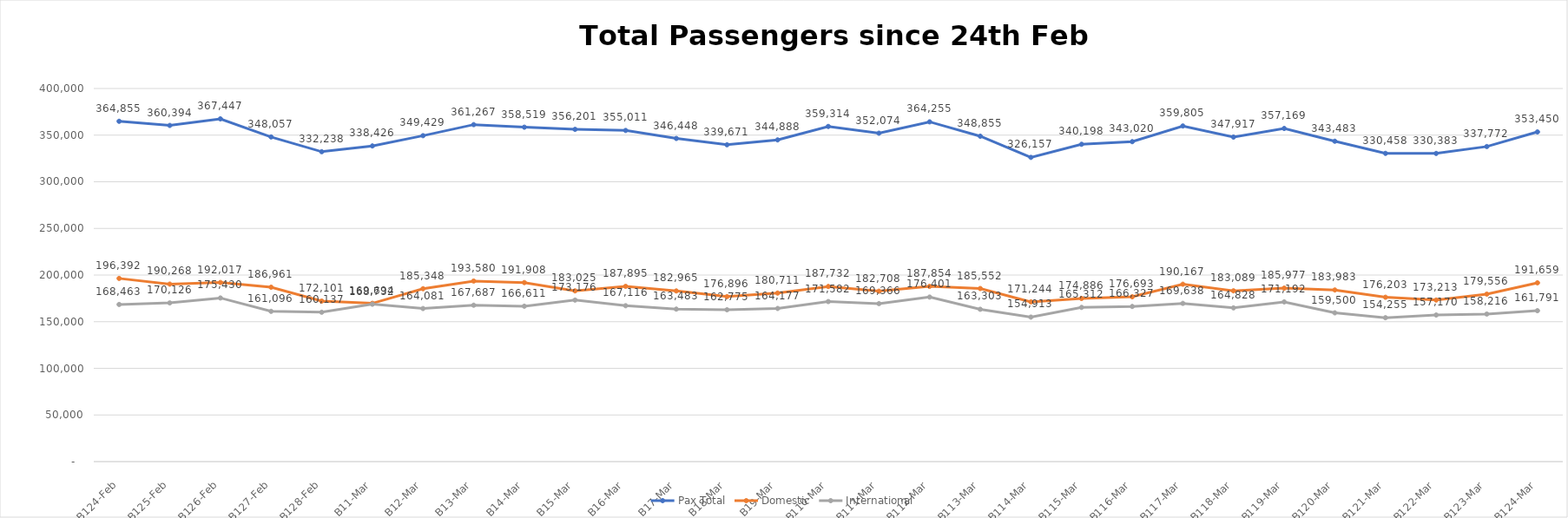
| Category | Pax Total |  Domestic  |  International  |
|---|---|---|---|
| 2023-02-24 | 364855 | 196392 | 168463 |
| 2023-02-25 | 360394 | 190268 | 170126 |
| 2023-02-26 | 367447 | 192017 | 175430 |
| 2023-02-27 | 348057 | 186961 | 161096 |
| 2023-02-28 | 332238 | 172101 | 160137 |
| 2023-03-01 | 338426 | 169694 | 168732 |
| 2023-03-02 | 349429 | 185348 | 164081 |
| 2023-03-03 | 361267 | 193580 | 167687 |
| 2023-03-04 | 358519 | 191908 | 166611 |
| 2023-03-05 | 356201 | 183025 | 173176 |
| 2023-03-06 | 355011 | 187895 | 167116 |
| 2023-03-07 | 346448 | 182965 | 163483 |
| 2023-03-08 | 339671 | 176896 | 162775 |
| 2023-03-09 | 344888 | 180711 | 164177 |
| 2023-03-10 | 359314 | 187732 | 171582 |
| 2023-03-11 | 352074 | 182708 | 169366 |
| 2023-03-12 | 364255 | 187854 | 176401 |
| 2023-03-13 | 348855 | 185552 | 163303 |
| 2023-03-14 | 326157 | 171244 | 154913 |
| 2023-03-15 | 340198 | 174886 | 165312 |
| 2023-03-16 | 343020 | 176693 | 166327 |
| 2023-03-17 | 359805 | 190167 | 169638 |
| 2023-03-18 | 347917 | 183089 | 164828 |
| 2023-03-19 | 357169 | 185977 | 171192 |
| 2023-03-20 | 343483 | 183983 | 159500 |
| 2023-03-21 | 330458 | 176203 | 154255 |
| 2023-03-22 | 330383 | 173213 | 157170 |
| 2023-03-23 | 337772 | 179556 | 158216 |
| 2023-03-24 | 353450 | 191659 | 161791 |